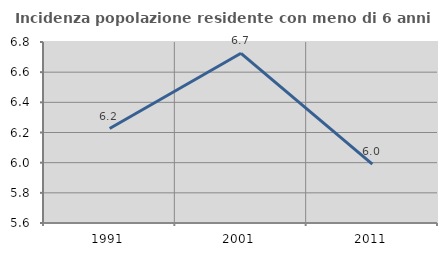
| Category | Incidenza popolazione residente con meno di 6 anni |
|---|---|
| 1991.0 | 6.226 |
| 2001.0 | 6.725 |
| 2011.0 | 5.99 |